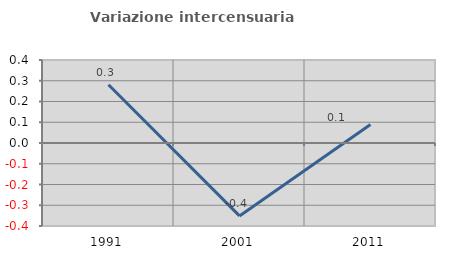
| Category | Variazione intercensuaria annua |
|---|---|
| 1991.0 | 0.281 |
| 2001.0 | -0.351 |
| 2011.0 | 0.089 |